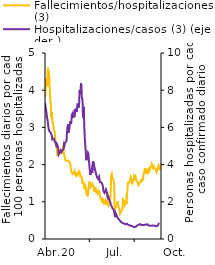
| Category | Fallecimientos/hospitalizaciones (3) |
|---|---|
| 2020-04-02 | 3.813 |
| 2020-04-03 | 3.927 |
| 2020-04-04 | 4.256 |
| 2020-04-05 | 4.325 |
| 2020-04-06 | 4.18 |
| 2020-04-07 | 4.106 |
| 2020-04-08 | 4.604 |
| 2020-04-09 | 4.432 |
| 2020-04-10 | 4.51 |
| 2020-04-11 | 4.191 |
| 2020-04-12 | 4.012 |
| 2020-04-13 | 3.723 |
| 2020-04-14 | 3.612 |
| 2020-04-15 | 3.271 |
| 2020-04-16 | 3.404 |
| 2020-04-17 | 3.189 |
| 2020-04-18 | 3.097 |
| 2020-04-19 | 3.069 |
| 2020-04-20 | 2.943 |
| 2020-04-21 | 2.962 |
| 2020-04-22 | 2.883 |
| 2020-04-23 | 2.653 |
| 2020-04-24 | 2.629 |
| 2020-04-25 | 2.549 |
| 2020-04-26 | 2.459 |
| 2020-04-27 | 2.293 |
| 2020-04-28 | 2.238 |
| 2020-04-29 | 2.3 |
| 2020-04-30 | 2.388 |
| 2020-05-01 | 2.333 |
| 2020-05-02 | 2.316 |
| 2020-05-03 | 2.369 |
| 2020-05-04 | 2.337 |
| 2020-05-05 | 2.365 |
| 2020-05-06 | 2.286 |
| 2020-05-07 | 2.409 |
| 2020-05-08 | 2.437 |
| 2020-05-09 | 2.467 |
| 2020-05-10 | 2.356 |
| 2020-05-11 | 2.332 |
| 2020-05-12 | 2.233 |
| 2020-05-13 | 2.241 |
| 2020-05-14 | 2.115 |
| 2020-05-15 | 2.11 |
| 2020-05-16 | 2.135 |
| 2020-05-17 | 2.099 |
| 2020-05-18 | 2.099 |
| 2020-05-19 | 2.087 |
| 2020-05-20 | 2.102 |
| 2020-05-21 | 2.099 |
| 2020-05-22 | 2.101 |
| 2020-05-23 | 2.06 |
| 2020-05-24 | 2.019 |
| 2020-05-25 | 1.908 |
| 2020-05-26 | 1.817 |
| 2020-05-27 | 1.782 |
| 2020-05-28 | 1.777 |
| 2020-05-29 | 1.748 |
| 2020-05-30 | 1.726 |
| 2020-05-31 | 1.741 |
| 2020-06-01 | 1.797 |
| 2020-06-02 | 1.828 |
| 2020-06-03 | 1.775 |
| 2020-06-04 | 1.716 |
| 2020-06-05 | 1.74 |
| 2020-06-06 | 1.75 |
| 2020-06-07 | 1.711 |
| 2020-06-08 | 1.717 |
| 2020-06-09 | 1.747 |
| 2020-06-10 | 1.796 |
| 2020-06-11 | 1.839 |
| 2020-06-12 | 1.833 |
| 2020-06-13 | 1.688 |
| 2020-06-14 | 1.671 |
| 2020-06-15 | 1.678 |
| 2020-06-16 | 1.684 |
| 2020-06-17 | 1.58 |
| 2020-06-18 | 1.499 |
| 2020-06-19 | 1.559 |
| 2020-06-20 | 1.495 |
| 2020-06-21 | 1.406 |
| 2020-06-22 | 1.408 |
| 2020-06-23 | 1.44 |
| 2020-06-24 | 1.433 |
| 2020-06-25 | 1.285 |
| 2020-06-26 | 1.318 |
| 2020-06-27 | 1.292 |
| 2020-06-28 | 1.146 |
| 2020-06-29 | 1.198 |
| 2020-06-30 | 1.213 |
| 2020-07-01 | 1.218 |
| 2020-07-02 | 1.543 |
| 2020-07-03 | 1.518 |
| 2020-07-04 | 1.425 |
| 2020-07-05 | 1.392 |
| 2020-07-06 | 1.385 |
| 2020-07-07 | 1.445 |
| 2020-07-08 | 1.481 |
| 2020-07-09 | 1.444 |
| 2020-07-10 | 1.46 |
| 2020-07-11 | 1.402 |
| 2020-07-12 | 1.275 |
| 2020-07-13 | 1.292 |
| 2020-07-14 | 1.392 |
| 2020-07-15 | 1.307 |
| 2020-07-16 | 1.235 |
| 2020-07-17 | 1.296 |
| 2020-07-18 | 1.27 |
| 2020-07-19 | 1.228 |
| 2020-07-20 | 1.249 |
| 2020-07-21 | 1.293 |
| 2020-07-22 | 1.28 |
| 2020-07-23 | 1.257 |
| 2020-07-24 | 1.125 |
| 2020-07-25 | 1.12 |
| 2020-07-26 | 1.07 |
| 2020-07-27 | 1.113 |
| 2020-07-28 | 0.974 |
| 2020-07-29 | 0.986 |
| 2020-07-30 | 1.086 |
| 2020-07-31 | 1.008 |
| 2020-08-01 | 0.961 |
| 2020-08-02 | 0.953 |
| 2020-08-03 | 0.96 |
| 2020-08-04 | 1.033 |
| 2020-08-05 | 0.954 |
| 2020-08-06 | 0.915 |
| 2020-08-07 | 1.05 |
| 2020-08-08 | 0.962 |
| 2020-08-09 | 0.96 |
| 2020-08-10 | 0.9 |
| 2020-08-11 | 0.946 |
| 2020-08-12 | 0.939 |
| 2020-08-13 | 1.01 |
| 2020-08-14 | 1.067 |
| 2020-08-15 | 1.08 |
| 2020-08-16 | 1.721 |
| 2020-08-17 | 1.751 |
| 2020-08-18 | 1.651 |
| 2020-08-19 | 1.642 |
| 2020-08-20 | 1.649 |
| 2020-08-21 | 1.573 |
| 2020-08-22 | 1.489 |
| 2020-08-23 | 0.794 |
| 2020-08-24 | 0.829 |
| 2020-08-25 | 0.84 |
| 2020-08-26 | 0.861 |
| 2020-08-27 | 0.916 |
| 2020-08-28 | 0.921 |
| 2020-08-29 | 1.02 |
| 2020-08-30 | 0.93 |
| 2020-08-31 | 0.883 |
| 2020-09-01 | 0.891 |
| 2020-09-02 | 0.772 |
| 2020-09-03 | 0.679 |
| 2020-09-04 | 0.7 |
| 2020-09-05 | 0.701 |
| 2020-09-06 | 0.758 |
| 2020-09-07 | 0.755 |
| 2020-09-08 | 0.815 |
| 2020-09-09 | 1.064 |
| 2020-09-10 | 1.053 |
| 2020-09-11 | 1.064 |
| 2020-09-12 | 1.009 |
| 2020-09-13 | 0.912 |
| 2020-09-14 | 0.942 |
| 2020-09-15 | 0.982 |
| 2020-09-16 | 0.938 |
| 2020-09-17 | 1.218 |
| 2020-09-18 | 1.284 |
| 2020-09-19 | 1.535 |
| 2020-09-20 | 1.505 |
| 2020-09-21 | 1.496 |
| 2020-09-22 | 1.493 |
| 2020-09-23 | 1.536 |
| 2020-09-24 | 1.589 |
| 2020-09-25 | 1.663 |
| 2020-09-26 | 1.627 |
| 2020-09-27 | 1.548 |
| 2020-09-28 | 1.5 |
| 2020-09-29 | 1.484 |
| 2020-09-30 | 1.566 |
| 2020-10-01 | 1.62 |
| 2020-10-02 | 1.689 |
| 2020-10-03 | 1.696 |
| 2020-10-04 | 1.626 |
| 2020-10-05 | 1.665 |
| 2020-10-06 | 1.614 |
| 2020-10-07 | 1.576 |
| 2020-10-08 | 1.537 |
| 2020-10-09 | 1.545 |
| 2020-10-10 | 1.489 |
| 2020-10-11 | 1.455 |
| 2020-10-12 | 1.454 |
| 2020-10-13 | 1.464 |
| 2020-10-14 | 1.534 |
| 2020-10-15 | 1.514 |
| 2020-10-16 | 1.524 |
| 2020-10-17 | 1.59 |
| 2020-10-18 | 1.559 |
| 2020-10-19 | 1.581 |
| 2020-10-20 | 1.604 |
| 2020-10-21 | 1.725 |
| 2020-10-22 | 1.773 |
| 2020-10-23 | 1.804 |
| 2020-10-24 | 1.899 |
| 2020-10-25 | 1.832 |
| 2020-10-26 | 1.751 |
| 2020-10-27 | 1.76 |
| 2020-10-28 | 1.833 |
| 2020-10-29 | 1.788 |
| 2020-10-30 | 1.78 |
| 2020-10-31 | 1.863 |
| 2020-11-01 | 1.808 |
| 2020-11-02 | 1.784 |
| 2020-11-03 | 1.865 |
| 2020-11-04 | 1.928 |
| 2020-11-05 | 1.934 |
| 2020-11-06 | 1.958 |
| 2020-11-07 | 2.023 |
| 2020-11-08 | 1.992 |
| 2020-11-09 | 1.939 |
| 2020-11-10 | 1.877 |
| 2020-11-11 | 1.973 |
| 2020-11-12 | 1.915 |
| 2020-11-13 | 1.911 |
| 2020-11-14 | 1.92 |
| 2020-11-15 | 1.888 |
| 2020-11-16 | 1.847 |
| 2020-11-17 | 1.798 |
| 2020-11-18 | 1.795 |
| 2020-11-19 | 1.879 |
| 2020-11-20 | 1.932 |
| 2020-11-21 | 1.972 |
| 2020-11-22 | 1.916 |
| 2020-11-23 | 1.887 |
| 2020-11-24 | 1.907 |
| 2020-11-25 | 1.947 |
| 2020-11-26 | 1.855 |